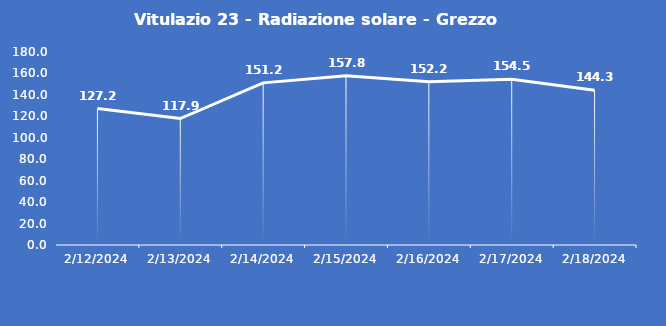
| Category | Vitulazio 23 - Radiazione solare - Grezzo (W/m2) |
|---|---|
| 2/12/24 | 127.2 |
| 2/13/24 | 117.9 |
| 2/14/24 | 151.2 |
| 2/15/24 | 157.8 |
| 2/16/24 | 152.2 |
| 2/17/24 | 154.5 |
| 2/18/24 | 144.3 |